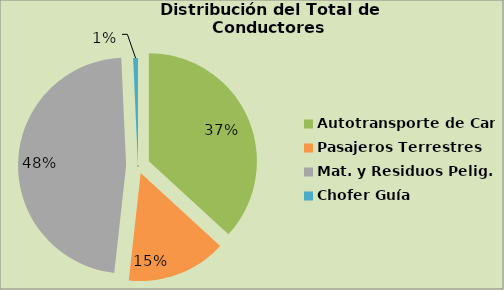
| Category | Series 0 |
|---|---|
| Autotransporte de Carga | 36.821 |
| Pasajeros Terrestres | 14.933 |
| Mat. y Residuos Pelig. | 47.525 |
| Chofer Guía | 0.721 |